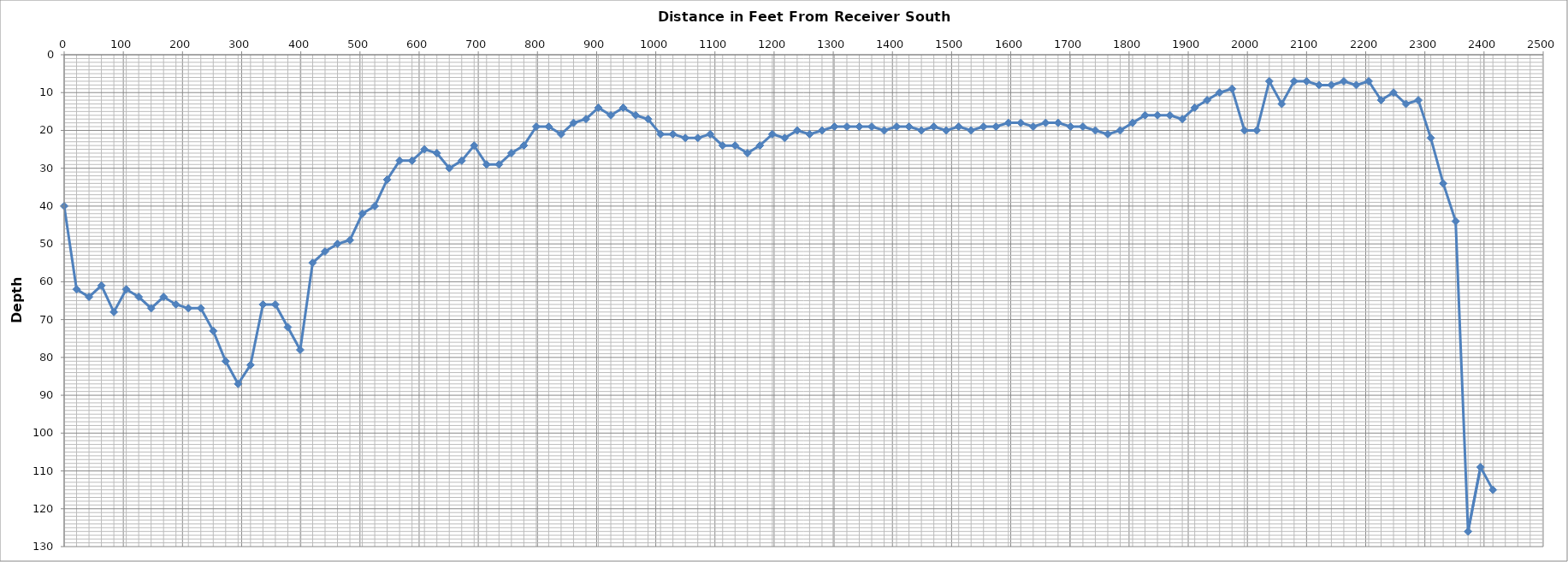
| Category | Series 0 |
|---|---|
| 0.0 | 40 |
| 21.0 | 62 |
| 42.0 | 64 |
| 63.0 | 61 |
| 84.0 | 68 |
| 105.0 | 62 |
| 126.0 | 64 |
| 147.0 | 67 |
| 168.0 | 64 |
| 189.0 | 66 |
| 210.0 | 67 |
| 231.0 | 67 |
| 252.0 | 73 |
| 273.0 | 81 |
| 294.0 | 87 |
| 315.0 | 82 |
| 336.0 | 66 |
| 357.0 | 66 |
| 378.0 | 72 |
| 399.0 | 78 |
| 420.0 | 55 |
| 441.0 | 52 |
| 462.0 | 50 |
| 483.0 | 49 |
| 504.0 | 42 |
| 525.0 | 40 |
| 546.0 | 33 |
| 567.0 | 28 |
| 588.0 | 28 |
| 609.0 | 25 |
| 630.0 | 26 |
| 651.0 | 30 |
| 672.0 | 28 |
| 693.0 | 24 |
| 714.0 | 29 |
| 735.0 | 29 |
| 756.0 | 26 |
| 777.0 | 24 |
| 798.0 | 19 |
| 819.0 | 19 |
| 840.0 | 21 |
| 861.0 | 18 |
| 882.0 | 17 |
| 903.0 | 14 |
| 924.0 | 16 |
| 945.0 | 14 |
| 966.0 | 16 |
| 987.0 | 17 |
| 1008.0 | 21 |
| 1029.0 | 21 |
| 1050.0 | 22 |
| 1071.0 | 22 |
| 1092.0 | 21 |
| 1113.0 | 24 |
| 1134.0 | 24 |
| 1155.0 | 26 |
| 1176.0 | 24 |
| 1197.0 | 21 |
| 1218.0 | 22 |
| 1239.0 | 20 |
| 1260.0 | 21 |
| 1281.0 | 20 |
| 1302.0 | 19 |
| 1323.0 | 19 |
| 1344.0 | 19 |
| 1365.0 | 19 |
| 1386.0 | 20 |
| 1407.0 | 19 |
| 1428.0 | 19 |
| 1449.0 | 20 |
| 1470.0 | 19 |
| 1491.0 | 20 |
| 1512.0 | 19 |
| 1533.0 | 20 |
| 1554.0 | 19 |
| 1575.0 | 19 |
| 1596.0 | 18 |
| 1617.0 | 18 |
| 1638.0 | 19 |
| 1659.0 | 18 |
| 1680.0 | 18 |
| 1701.0 | 19 |
| 1722.0 | 19 |
| 1743.0 | 20 |
| 1764.0 | 21 |
| 1785.0 | 20 |
| 1806.0 | 18 |
| 1827.0 | 16 |
| 1848.0 | 16 |
| 1869.0 | 16 |
| 1890.0 | 17 |
| 1911.0 | 14 |
| 1932.0 | 12 |
| 1953.0 | 10 |
| 1974.0 | 9 |
| 1995.0 | 20 |
| 2016.0 | 20 |
| 2037.0 | 7 |
| 2058.0 | 13 |
| 2079.0 | 7 |
| 2100.0 | 7 |
| 2121.0 | 8 |
| 2142.0 | 8 |
| 2163.0 | 7 |
| 2184.0 | 8 |
| 2205.0 | 7 |
| 2226.0 | 12 |
| 2247.0 | 10 |
| 2268.0 | 13 |
| 2289.0 | 12 |
| 2310.0 | 22 |
| 2331.0 | 34 |
| 2352.0 | 44 |
| 2373.0 | 126 |
| 2394.0 | 109 |
| 2415.0 | 115 |